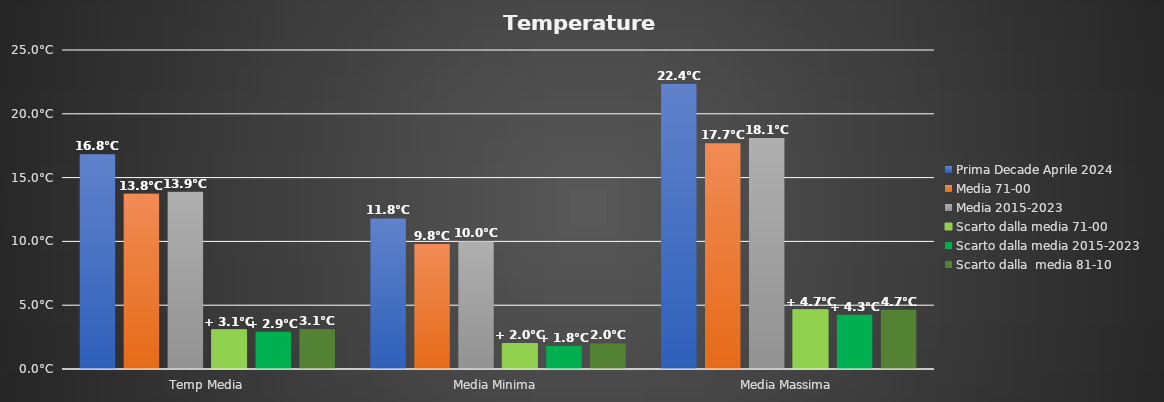
| Category | Prima Decade Aprile 2024 | Media 71-00 | Media 2015-2023 | Scarto dalla media 71-00 | Scarto dalla media 2015-2023 | Scarto dalla  media 81-10 |
|---|---|---|---|---|---|---|
| Temp Media | 16.827 | 13.75 | 13.9 | 3.077 | 2.927 | 3.127 |
| Media Minima  | 11.8 | 9.8 | 10 | 2 | 1.8 | 2 |
| Media Massima | 22.35 | 17.7 | 18.1 | 4.65 | 4.25 | 4.65 |